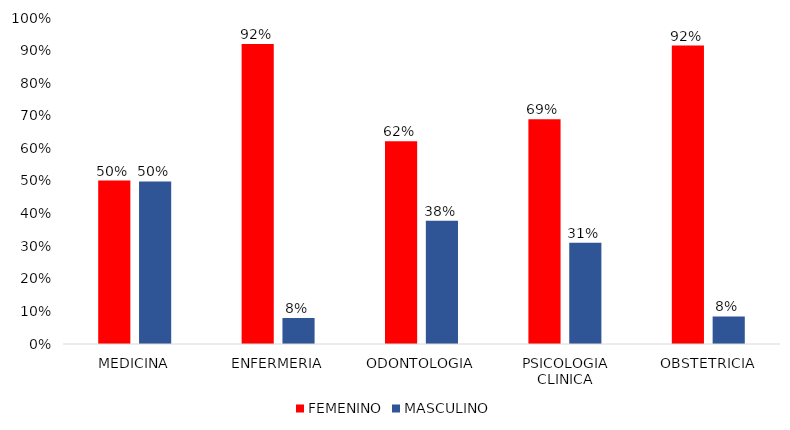
| Category | FEMENINO | MASCULINO |
|---|---|---|
| MEDICINA | 0.502 | 0.498 |
| ENFERMERIA | 0.92 | 0.08 |
| ODONTOLOGIA | 0.622 | 0.378 |
| PSICOLOGIA CLINICA | 0.689 | 0.311 |
| OBSTETRICIA | 0.916 | 0.084 |